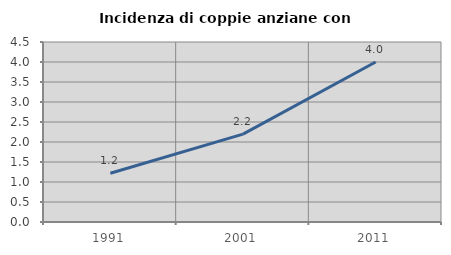
| Category | Incidenza di coppie anziane con figli |
|---|---|
| 1991.0 | 1.22 |
| 2001.0 | 2.198 |
| 2011.0 | 4 |